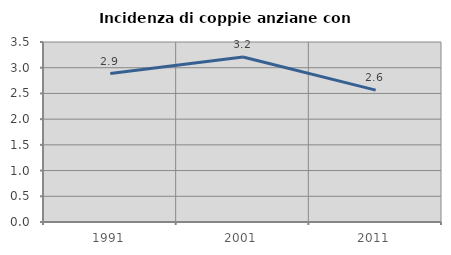
| Category | Incidenza di coppie anziane con figli |
|---|---|
| 1991.0 | 2.886 |
| 2001.0 | 3.208 |
| 2011.0 | 2.564 |